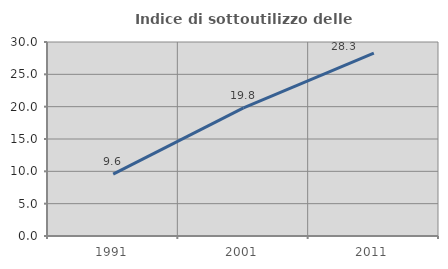
| Category | Indice di sottoutilizzo delle abitazioni  |
|---|---|
| 1991.0 | 9.565 |
| 2001.0 | 19.82 |
| 2011.0 | 28.283 |